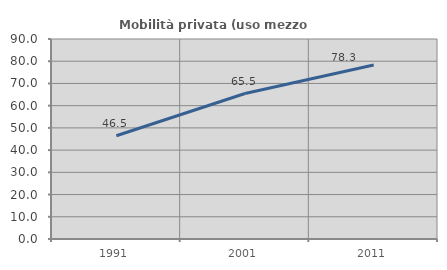
| Category | Mobilità privata (uso mezzo privato) |
|---|---|
| 1991.0 | 46.475 |
| 2001.0 | 65.465 |
| 2011.0 | 78.325 |